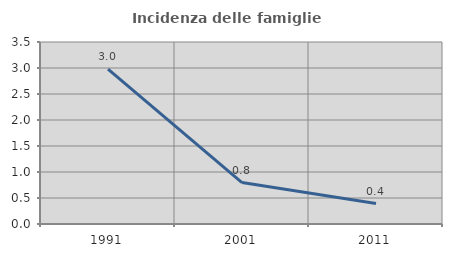
| Category | Incidenza delle famiglie numerose |
|---|---|
| 1991.0 | 2.979 |
| 2001.0 | 0.797 |
| 2011.0 | 0.394 |